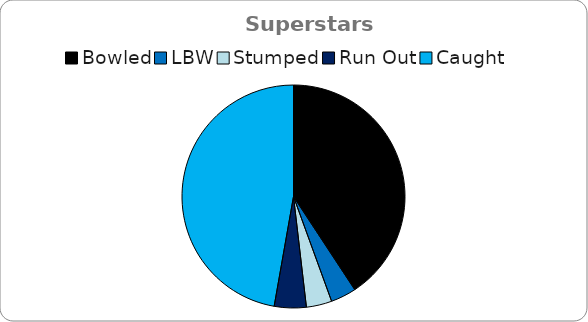
| Category | Superstars batting |
|---|---|
| Bowled | 44 |
| LBW | 4 |
| Stumped | 4 |
| Run Out | 5 |
| Caught | 51 |